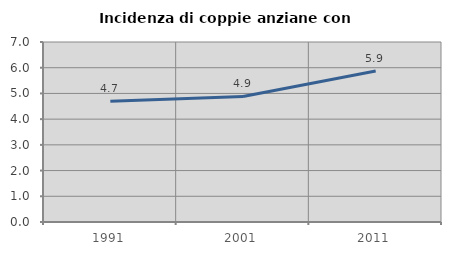
| Category | Incidenza di coppie anziane con figli |
|---|---|
| 1991.0 | 4.694 |
| 2001.0 | 4.883 |
| 2011.0 | 5.87 |